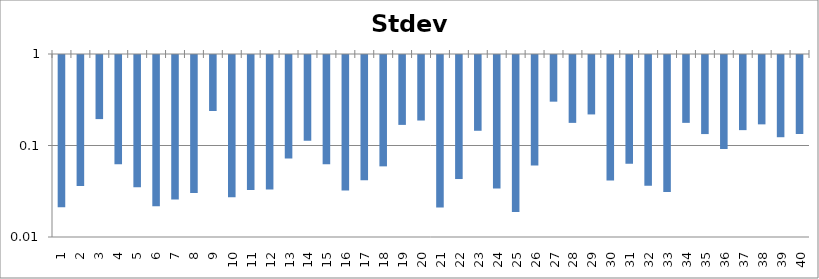
| Category | Stdev |
|---|---|
| 1.0 | 0.022 |
| 2.0 | 0.037 |
| 3.0 | 0.199 |
| 4.0 | 0.064 |
| 5.0 | 0.036 |
| 6.0 | 0.022 |
| 7.0 | 0.026 |
| 8.0 | 0.031 |
| 9.0 | 0.244 |
| 10.0 | 0.028 |
| 11.0 | 0.033 |
| 12.0 | 0.034 |
| 13.0 | 0.074 |
| 14.0 | 0.116 |
| 15.0 | 0.064 |
| 16.0 | 0.033 |
| 17.0 | 0.043 |
| 18.0 | 0.061 |
| 19.0 | 0.172 |
| 20.0 | 0.192 |
| 21.0 | 0.022 |
| 22.0 | 0.044 |
| 23.0 | 0.149 |
| 24.0 | 0.035 |
| 25.0 | 0.019 |
| 26.0 | 0.062 |
| 27.0 | 0.309 |
| 28.0 | 0.181 |
| 29.0 | 0.224 |
| 30.0 | 0.043 |
| 31.0 | 0.065 |
| 32.0 | 0.037 |
| 33.0 | 0.032 |
| 34.0 | 0.181 |
| 35.0 | 0.137 |
| 36.0 | 0.094 |
| 37.0 | 0.151 |
| 38.0 | 0.175 |
| 39.0 | 0.126 |
| 40.0 | 0.137 |